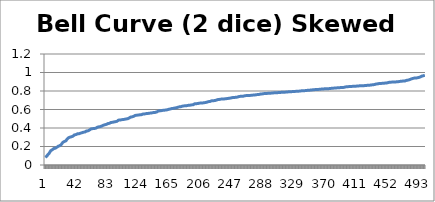
| Category | Bell Curve (2 dice) Skewed High |
|---|---|
| 0 | 0.082 |
| 1 | 0.092 |
| 2 | 0.097 |
| 3 | 0.109 |
| 4 | 0.115 |
| 5 | 0.127 |
| 6 | 0.128 |
| 7 | 0.155 |
| 8 | 0.161 |
| 9 | 0.165 |
| 10 | 0.17 |
| 11 | 0.178 |
| 12 | 0.18 |
| 13 | 0.182 |
| 14 | 0.185 |
| 15 | 0.192 |
| 16 | 0.197 |
| 17 | 0.203 |
| 18 | 0.208 |
| 19 | 0.209 |
| 20 | 0.214 |
| 21 | 0.223 |
| 22 | 0.227 |
| 23 | 0.245 |
| 24 | 0.25 |
| 25 | 0.255 |
| 26 | 0.258 |
| 27 | 0.261 |
| 28 | 0.274 |
| 29 | 0.28 |
| 30 | 0.293 |
| 31 | 0.3 |
| 32 | 0.3 |
| 33 | 0.301 |
| 34 | 0.305 |
| 35 | 0.309 |
| 36 | 0.311 |
| 37 | 0.32 |
| 38 | 0.325 |
| 39 | 0.328 |
| 40 | 0.329 |
| 41 | 0.33 |
| 42 | 0.337 |
| 43 | 0.337 |
| 44 | 0.338 |
| 45 | 0.341 |
| 46 | 0.344 |
| 47 | 0.349 |
| 48 | 0.349 |
| 49 | 0.352 |
| 50 | 0.355 |
| 51 | 0.357 |
| 52 | 0.357 |
| 53 | 0.365 |
| 54 | 0.368 |
| 55 | 0.368 |
| 56 | 0.369 |
| 57 | 0.379 |
| 58 | 0.379 |
| 59 | 0.379 |
| 60 | 0.39 |
| 61 | 0.393 |
| 62 | 0.393 |
| 63 | 0.394 |
| 64 | 0.395 |
| 65 | 0.396 |
| 66 | 0.397 |
| 67 | 0.406 |
| 68 | 0.407 |
| 69 | 0.41 |
| 70 | 0.412 |
| 71 | 0.414 |
| 72 | 0.415 |
| 73 | 0.417 |
| 74 | 0.421 |
| 75 | 0.426 |
| 76 | 0.43 |
| 77 | 0.434 |
| 78 | 0.435 |
| 79 | 0.438 |
| 80 | 0.439 |
| 81 | 0.44 |
| 82 | 0.447 |
| 83 | 0.45 |
| 84 | 0.45 |
| 85 | 0.455 |
| 86 | 0.459 |
| 87 | 0.46 |
| 88 | 0.462 |
| 89 | 0.463 |
| 90 | 0.465 |
| 91 | 0.468 |
| 92 | 0.468 |
| 93 | 0.471 |
| 94 | 0.473 |
| 95 | 0.473 |
| 96 | 0.485 |
| 97 | 0.485 |
| 98 | 0.486 |
| 99 | 0.489 |
| 100 | 0.49 |
| 101 | 0.491 |
| 102 | 0.491 |
| 103 | 0.493 |
| 104 | 0.494 |
| 105 | 0.495 |
| 106 | 0.498 |
| 107 | 0.499 |
| 108 | 0.5 |
| 109 | 0.503 |
| 110 | 0.509 |
| 111 | 0.512 |
| 112 | 0.518 |
| 113 | 0.518 |
| 114 | 0.521 |
| 115 | 0.524 |
| 116 | 0.527 |
| 117 | 0.527 |
| 118 | 0.536 |
| 119 | 0.537 |
| 120 | 0.539 |
| 121 | 0.539 |
| 122 | 0.54 |
| 123 | 0.541 |
| 124 | 0.543 |
| 125 | 0.543 |
| 126 | 0.544 |
| 127 | 0.549 |
| 128 | 0.551 |
| 129 | 0.551 |
| 130 | 0.552 |
| 131 | 0.554 |
| 132 | 0.555 |
| 133 | 0.556 |
| 134 | 0.556 |
| 135 | 0.557 |
| 136 | 0.56 |
| 137 | 0.561 |
| 138 | 0.561 |
| 139 | 0.562 |
| 140 | 0.564 |
| 141 | 0.565 |
| 142 | 0.567 |
| 143 | 0.567 |
| 144 | 0.569 |
| 145 | 0.571 |
| 146 | 0.573 |
| 147 | 0.575 |
| 148 | 0.582 |
| 149 | 0.582 |
| 150 | 0.586 |
| 151 | 0.586 |
| 152 | 0.587 |
| 153 | 0.59 |
| 154 | 0.591 |
| 155 | 0.591 |
| 156 | 0.592 |
| 157 | 0.593 |
| 158 | 0.594 |
| 159 | 0.595 |
| 160 | 0.597 |
| 161 | 0.6 |
| 162 | 0.602 |
| 163 | 0.605 |
| 164 | 0.606 |
| 165 | 0.608 |
| 166 | 0.61 |
| 167 | 0.612 |
| 168 | 0.613 |
| 169 | 0.615 |
| 170 | 0.616 |
| 171 | 0.617 |
| 172 | 0.62 |
| 173 | 0.62 |
| 174 | 0.624 |
| 175 | 0.628 |
| 176 | 0.63 |
| 177 | 0.631 |
| 178 | 0.631 |
| 179 | 0.633 |
| 180 | 0.636 |
| 181 | 0.639 |
| 182 | 0.639 |
| 183 | 0.639 |
| 184 | 0.64 |
| 185 | 0.641 |
| 186 | 0.642 |
| 187 | 0.645 |
| 188 | 0.646 |
| 189 | 0.646 |
| 190 | 0.647 |
| 191 | 0.648 |
| 192 | 0.65 |
| 193 | 0.652 |
| 194 | 0.652 |
| 195 | 0.661 |
| 196 | 0.662 |
| 197 | 0.662 |
| 198 | 0.663 |
| 199 | 0.664 |
| 200 | 0.664 |
| 201 | 0.665 |
| 202 | 0.669 |
| 203 | 0.669 |
| 204 | 0.67 |
| 205 | 0.67 |
| 206 | 0.67 |
| 207 | 0.672 |
| 208 | 0.673 |
| 209 | 0.675 |
| 210 | 0.675 |
| 211 | 0.677 |
| 212 | 0.679 |
| 213 | 0.68 |
| 214 | 0.685 |
| 215 | 0.685 |
| 216 | 0.687 |
| 217 | 0.687 |
| 218 | 0.694 |
| 219 | 0.694 |
| 220 | 0.696 |
| 221 | 0.696 |
| 222 | 0.696 |
| 223 | 0.698 |
| 224 | 0.7 |
| 225 | 0.706 |
| 226 | 0.707 |
| 227 | 0.707 |
| 228 | 0.708 |
| 229 | 0.71 |
| 230 | 0.712 |
| 231 | 0.712 |
| 232 | 0.713 |
| 233 | 0.713 |
| 234 | 0.713 |
| 235 | 0.713 |
| 236 | 0.716 |
| 237 | 0.716 |
| 238 | 0.718 |
| 239 | 0.718 |
| 240 | 0.72 |
| 241 | 0.721 |
| 242 | 0.722 |
| 243 | 0.724 |
| 244 | 0.726 |
| 245 | 0.728 |
| 246 | 0.729 |
| 247 | 0.729 |
| 248 | 0.73 |
| 249 | 0.731 |
| 250 | 0.733 |
| 251 | 0.733 |
| 252 | 0.734 |
| 253 | 0.735 |
| 254 | 0.74 |
| 255 | 0.741 |
| 256 | 0.742 |
| 257 | 0.743 |
| 258 | 0.743 |
| 259 | 0.744 |
| 260 | 0.744 |
| 261 | 0.747 |
| 262 | 0.749 |
| 263 | 0.75 |
| 264 | 0.751 |
| 265 | 0.751 |
| 266 | 0.751 |
| 267 | 0.751 |
| 268 | 0.752 |
| 269 | 0.753 |
| 270 | 0.753 |
| 271 | 0.754 |
| 272 | 0.755 |
| 273 | 0.756 |
| 274 | 0.757 |
| 275 | 0.757 |
| 276 | 0.758 |
| 277 | 0.76 |
| 278 | 0.761 |
| 279 | 0.761 |
| 280 | 0.762 |
| 281 | 0.766 |
| 282 | 0.766 |
| 283 | 0.767 |
| 284 | 0.768 |
| 285 | 0.769 |
| 286 | 0.771 |
| 287 | 0.772 |
| 288 | 0.773 |
| 289 | 0.773 |
| 290 | 0.774 |
| 291 | 0.774 |
| 292 | 0.775 |
| 293 | 0.775 |
| 294 | 0.776 |
| 295 | 0.776 |
| 296 | 0.777 |
| 297 | 0.777 |
| 298 | 0.778 |
| 299 | 0.778 |
| 300 | 0.78 |
| 301 | 0.78 |
| 302 | 0.78 |
| 303 | 0.781 |
| 304 | 0.781 |
| 305 | 0.783 |
| 306 | 0.783 |
| 307 | 0.784 |
| 308 | 0.784 |
| 309 | 0.786 |
| 310 | 0.786 |
| 311 | 0.786 |
| 312 | 0.787 |
| 313 | 0.787 |
| 314 | 0.787 |
| 315 | 0.788 |
| 316 | 0.788 |
| 317 | 0.789 |
| 318 | 0.79 |
| 319 | 0.791 |
| 320 | 0.792 |
| 321 | 0.792 |
| 322 | 0.792 |
| 323 | 0.793 |
| 324 | 0.793 |
| 325 | 0.794 |
| 326 | 0.794 |
| 327 | 0.794 |
| 328 | 0.796 |
| 329 | 0.796 |
| 330 | 0.797 |
| 331 | 0.797 |
| 332 | 0.798 |
| 333 | 0.798 |
| 334 | 0.799 |
| 335 | 0.8 |
| 336 | 0.802 |
| 337 | 0.802 |
| 338 | 0.803 |
| 339 | 0.803 |
| 340 | 0.803 |
| 341 | 0.804 |
| 342 | 0.805 |
| 343 | 0.806 |
| 344 | 0.807 |
| 345 | 0.808 |
| 346 | 0.808 |
| 347 | 0.81 |
| 348 | 0.81 |
| 349 | 0.81 |
| 350 | 0.812 |
| 351 | 0.813 |
| 352 | 0.814 |
| 353 | 0.815 |
| 354 | 0.815 |
| 355 | 0.815 |
| 356 | 0.816 |
| 357 | 0.816 |
| 358 | 0.817 |
| 359 | 0.817 |
| 360 | 0.819 |
| 361 | 0.819 |
| 362 | 0.82 |
| 363 | 0.821 |
| 364 | 0.822 |
| 365 | 0.822 |
| 366 | 0.823 |
| 367 | 0.823 |
| 368 | 0.824 |
| 369 | 0.824 |
| 370 | 0.825 |
| 371 | 0.825 |
| 372 | 0.826 |
| 373 | 0.826 |
| 374 | 0.827 |
| 375 | 0.827 |
| 376 | 0.83 |
| 377 | 0.83 |
| 378 | 0.831 |
| 379 | 0.832 |
| 380 | 0.832 |
| 381 | 0.833 |
| 382 | 0.834 |
| 383 | 0.834 |
| 384 | 0.835 |
| 385 | 0.835 |
| 386 | 0.835 |
| 387 | 0.837 |
| 388 | 0.838 |
| 389 | 0.838 |
| 390 | 0.838 |
| 391 | 0.838 |
| 392 | 0.839 |
| 393 | 0.841 |
| 394 | 0.844 |
| 395 | 0.844 |
| 396 | 0.846 |
| 397 | 0.847 |
| 398 | 0.847 |
| 399 | 0.848 |
| 400 | 0.848 |
| 401 | 0.849 |
| 402 | 0.849 |
| 403 | 0.85 |
| 404 | 0.852 |
| 405 | 0.852 |
| 406 | 0.852 |
| 407 | 0.852 |
| 408 | 0.853 |
| 409 | 0.854 |
| 410 | 0.854 |
| 411 | 0.855 |
| 412 | 0.856 |
| 413 | 0.856 |
| 414 | 0.856 |
| 415 | 0.857 |
| 416 | 0.857 |
| 417 | 0.857 |
| 418 | 0.857 |
| 419 | 0.859 |
| 420 | 0.859 |
| 421 | 0.86 |
| 422 | 0.861 |
| 423 | 0.861 |
| 424 | 0.862 |
| 425 | 0.863 |
| 426 | 0.863 |
| 427 | 0.863 |
| 428 | 0.866 |
| 429 | 0.867 |
| 430 | 0.868 |
| 431 | 0.869 |
| 432 | 0.87 |
| 433 | 0.872 |
| 434 | 0.876 |
| 435 | 0.876 |
| 436 | 0.877 |
| 437 | 0.878 |
| 438 | 0.881 |
| 439 | 0.881 |
| 440 | 0.881 |
| 441 | 0.882 |
| 442 | 0.883 |
| 443 | 0.883 |
| 444 | 0.883 |
| 445 | 0.884 |
| 446 | 0.886 |
| 447 | 0.887 |
| 448 | 0.887 |
| 449 | 0.89 |
| 450 | 0.891 |
| 451 | 0.894 |
| 452 | 0.895 |
| 453 | 0.896 |
| 454 | 0.896 |
| 455 | 0.897 |
| 456 | 0.897 |
| 457 | 0.897 |
| 458 | 0.898 |
| 459 | 0.898 |
| 460 | 0.898 |
| 461 | 0.898 |
| 462 | 0.9 |
| 463 | 0.901 |
| 464 | 0.902 |
| 465 | 0.903 |
| 466 | 0.905 |
| 467 | 0.905 |
| 468 | 0.906 |
| 469 | 0.907 |
| 470 | 0.908 |
| 471 | 0.908 |
| 472 | 0.909 |
| 473 | 0.909 |
| 474 | 0.915 |
| 475 | 0.917 |
| 476 | 0.918 |
| 477 | 0.921 |
| 478 | 0.922 |
| 479 | 0.928 |
| 480 | 0.93 |
| 481 | 0.933 |
| 482 | 0.935 |
| 483 | 0.936 |
| 484 | 0.939 |
| 485 | 0.94 |
| 486 | 0.94 |
| 487 | 0.941 |
| 488 | 0.943 |
| 489 | 0.945 |
| 490 | 0.946 |
| 491 | 0.948 |
| 492 | 0.952 |
| 493 | 0.959 |
| 494 | 0.961 |
| 495 | 0.964 |
| 496 | 0.965 |
| 497 | 0.965 |
| 498 | 0.97 |
| 499 | 0.971 |